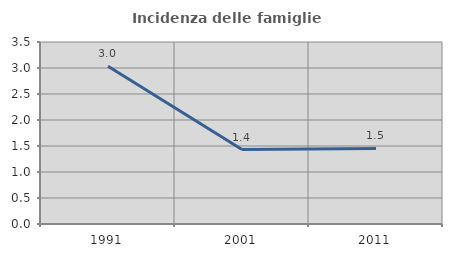
| Category | Incidenza delle famiglie numerose |
|---|---|
| 1991.0 | 3.033 |
| 2001.0 | 1.431 |
| 2011.0 | 1.454 |